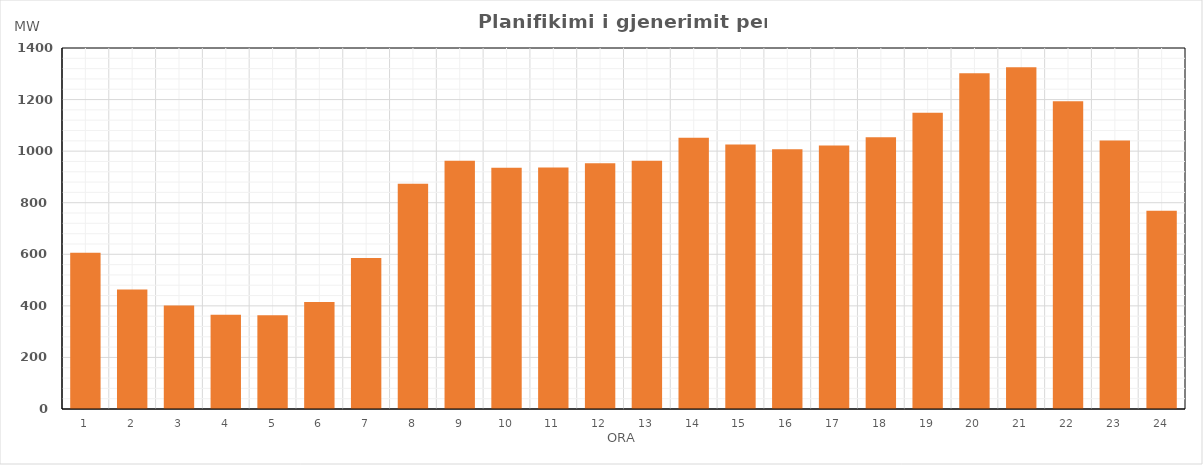
| Category | Max (MW) |
|---|---|
| 0 | 605.662 |
| 1 | 463.496 |
| 2 | 401.02 |
| 3 | 365.76 |
| 4 | 363.704 |
| 5 | 415.126 |
| 6 | 585.3 |
| 7 | 873.109 |
| 8 | 962.725 |
| 9 | 935.727 |
| 10 | 936.711 |
| 11 | 952.839 |
| 12 | 962.877 |
| 13 | 1052.3 |
| 14 | 1025.8 |
| 15 | 1007.689 |
| 16 | 1021.665 |
| 17 | 1053.6 |
| 18 | 1148.912 |
| 19 | 1302.01 |
| 20 | 1325.186 |
| 21 | 1193.684 |
| 22 | 1041.714 |
| 23 | 768.99 |